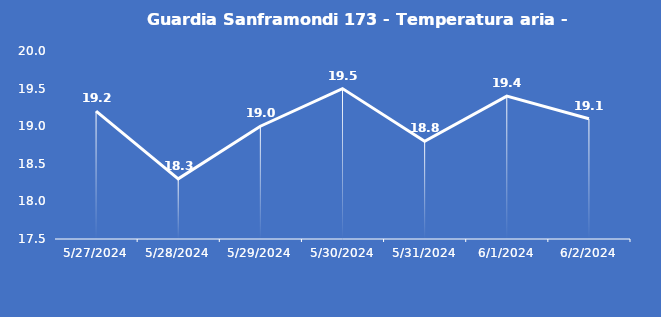
| Category | Guardia Sanframondi 173 - Temperatura aria - Grezzo (°C) |
|---|---|
| 5/27/24 | 19.2 |
| 5/28/24 | 18.3 |
| 5/29/24 | 19 |
| 5/30/24 | 19.5 |
| 5/31/24 | 18.8 |
| 6/1/24 | 19.4 |
| 6/2/24 | 19.1 |